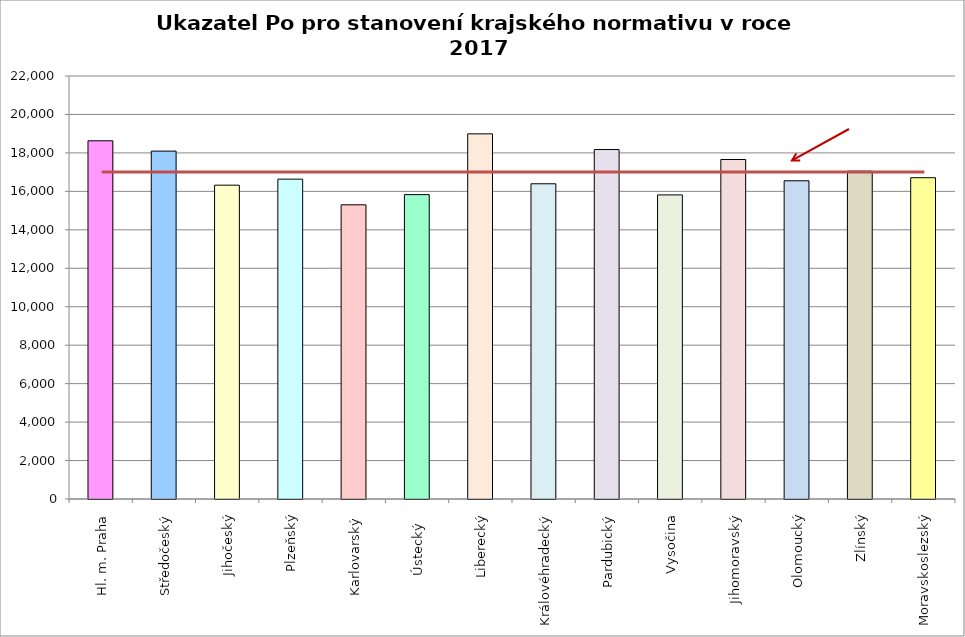
| Category | Series 0 |
|---|---|
| Hl. m. Praha | 18630 |
| Středočeský | 18094.2 |
| Jihočeský | 16322 |
| Plzeňský | 16635 |
| Karlovarský  | 15300 |
| Ústecký   | 15831 |
| Liberecký | 18990 |
| Královéhradecký | 16395 |
| Pardubický | 18175 |
| Vysočina | 15816 |
| Jihomoravský | 17657 |
| Olomoucký | 16551 |
| Zlínský | 17050 |
| Moravskoslezský | 16710 |